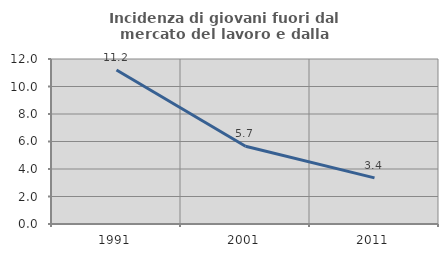
| Category | Incidenza di giovani fuori dal mercato del lavoro e dalla formazione  |
|---|---|
| 1991.0 | 11.194 |
| 2001.0 | 5.66 |
| 2011.0 | 3.352 |